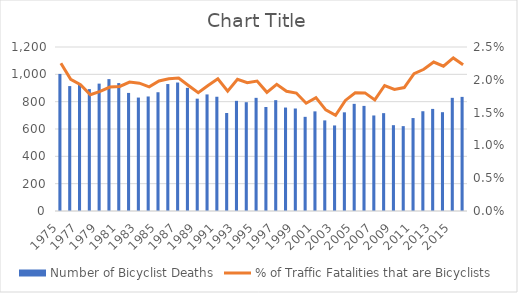
| Category | Number of Bicyclist Deaths |
|---|---|
| 1975.0 | 1003 |
| 1976.0 | 914 |
| 1977.0 | 922 |
| 1978.0 | 892 |
| 1979.0 | 932 |
| 1980.0 | 965 |
| 1981.0 | 936 |
| 1982.0 | 864 |
| 1983.0 | 830 |
| 1984.0 | 838 |
| 1985.0 | 869 |
| 1986.0 | 929 |
| 1987.0 | 940 |
| 1988.0 | 901 |
| 1989.0 | 822 |
| 1990.0 | 853 |
| 1991.0 | 836 |
| 1992.0 | 717 |
| 1993.0 | 806 |
| 1994.0 | 796 |
| 1995.0 | 828 |
| 1996.0 | 761 |
| 1997.0 | 811 |
| 1998.0 | 757 |
| 1999.0 | 750 |
| 2000.0 | 689 |
| 2001.0 | 729 |
| 2002.0 | 663 |
| 2003.0 | 626 |
| 2004.0 | 722 |
| 2005.0 | 784 |
| 2006.0 | 769 |
| 2007.0 | 699 |
| 2008.0 | 716 |
| 2009.0 | 628 |
| 2010.0 | 621 |
| 2011.0 | 680 |
| 2012.0 | 730 |
| 2013.0 | 747 |
| 2014.0 | 723 |
| 2015.0 | 828 |
| 2016.0 | 835 |